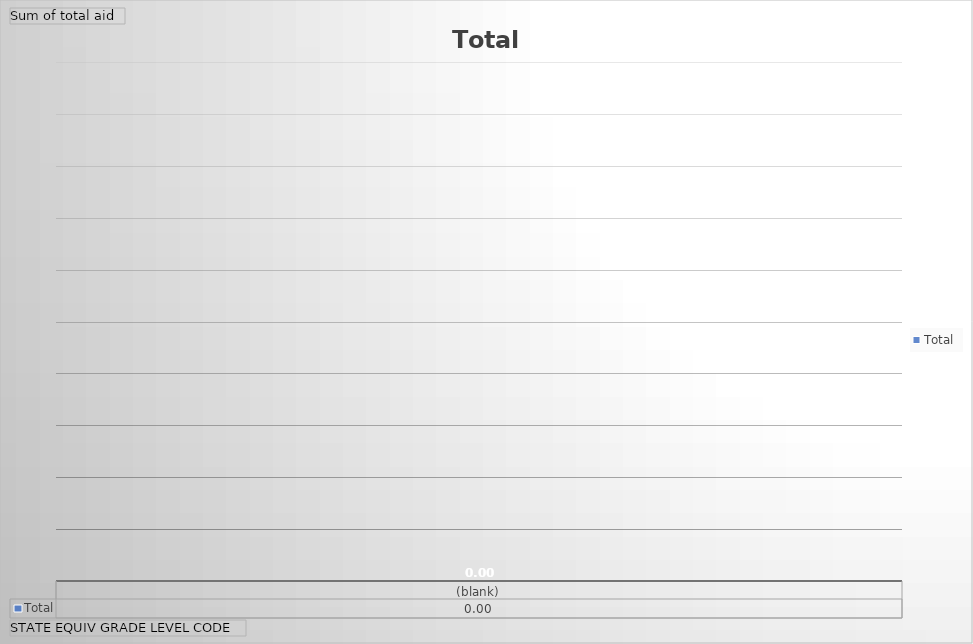
| Category | Total |
|---|---|
| (blank) | 0 |